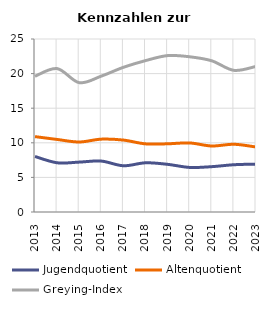
| Category | Jugendquotient | Altenquotient | Greying-Index |
|---|---|---|---|
| 2013.0 | 8.025 | 10.894 | 19.614 |
| 2014.0 | 7.111 | 10.484 | 20.724 |
| 2015.0 | 7.209 | 10.116 | 18.692 |
| 2016.0 | 7.358 | 10.528 | 19.637 |
| 2017.0 | 6.682 | 10.393 | 20.909 |
| 2018.0 | 7.11 | 9.847 | 21.875 |
| 2019.0 | 6.888 | 9.855 | 22.601 |
| 2020.0 | 6.44 | 9.98 | 22.43 |
| 2021.0 | 6.552 | 9.537 | 21.846 |
| 2022.0 | 6.83 | 9.79 | 20.47 |
| 2023.0 | 6.922 | 9.394 | 21.037 |